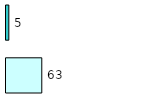
| Category | Series 0 | Series 1 |
|---|---|---|
| 0 | 63 | 5 |